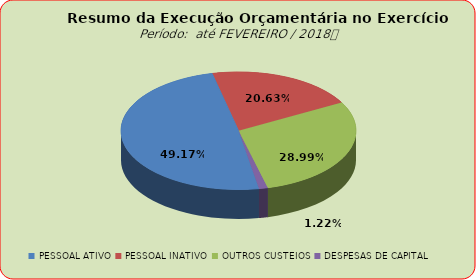
| Category | Series 0 |
|---|---|
| PESSOAL ATIVO | 26509247.86 |
| PESSOAL INATIVO | 11122792.38 |
| OUTROS CUSTEIOS | 15627302.44 |
| DESPESAS DE CAPITAL | 655150.93 |